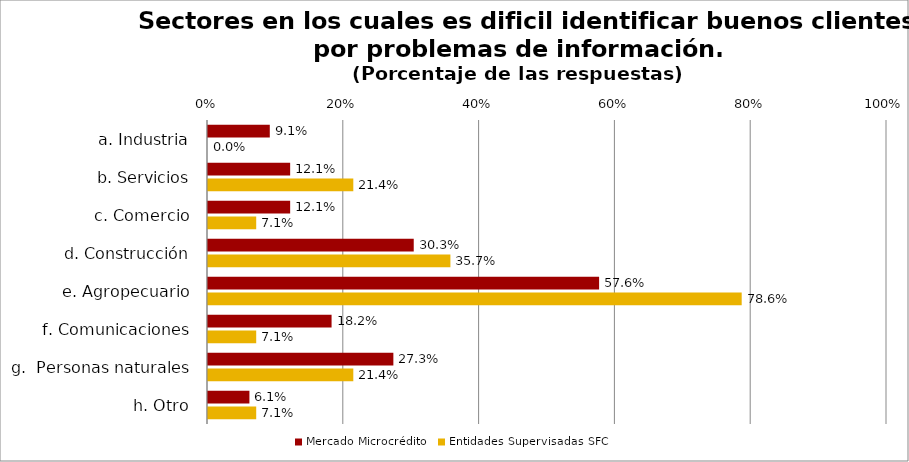
| Category | Mercado Microcrédito | Entidades Supervisadas SFC |
|---|---|---|
| a. Industria | 0.091 | 0 |
| b. Servicios | 0.121 | 0.214 |
| c. Comercio | 0.121 | 0.071 |
| d. Construcción | 0.303 | 0.357 |
| e. Agropecuario | 0.576 | 0.786 |
| f. Comunicaciones | 0.182 | 0.071 |
| g.  Personas naturales | 0.273 | 0.214 |
| h. Otro | 0.061 | 0.071 |